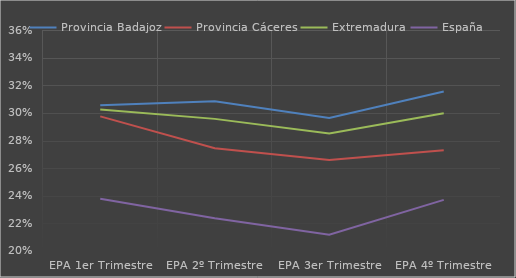
| Category | Provincia Badajoz | Provincia Cáceres | Extremadura | España |
|---|---|---|---|---|
| EPA 1er Trimestre | 0.305 | 0.297 | 0.302 | 0.238 |
| EPA 2º Trimestre | 0.308 | 0.274 | 0.296 | 0.224 |
| EPA 3er Trimestre | 0.296 | 0.266 | 0.285 | 0.212 |
| EPA 4º Trimestre | 0.315 | 0.273 | 0.3 | 0.237 |